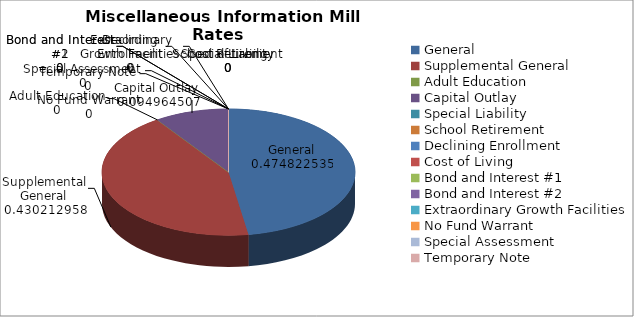
| Category | Mill Rates By Fund |
|---|---|
| General | 20 |
| Supplemental General | 18.121 |
| Adult Education | 0 |
| Capital Outlay | 4 |
| Special Liability | 0 |
| School Retirement | 0 |
| Declining Enrollment | 0 |
| Cost of Living | 0 |
| Bond and Interest #1 | 0 |
| Bond and Interest #2 | 0 |
| Extraordinary Growth Facilities | 0 |
| No Fund Warrant | 0 |
| Special Assessment | 0 |
| Temporary Note | 0 |